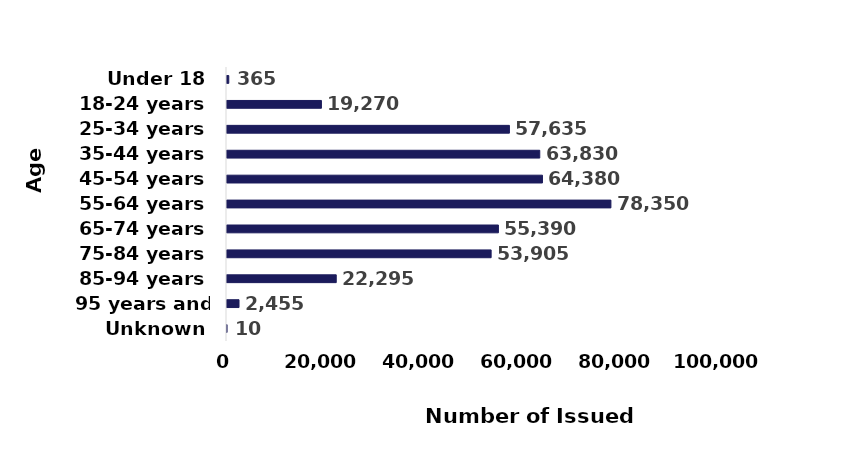
| Category | Number of issued payments |
|---|---|
| Under 18 | 365 |
| 18-24 years | 19270 |
| 25-34 years | 57635 |
| 35-44 years | 63830 |
| 45-54 years | 64380 |
| 55-64 years | 78350 |
| 65-74 years | 55390 |
| 75-84 years | 53905 |
| 85-94 years | 22295 |
| 95 years and older | 2455 |
| Unknown | 10 |